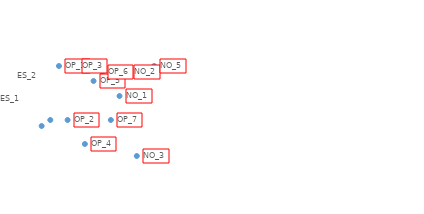
| Category | Series 0 |
|---|---|
| 0 | 5 |
| 1 | 5.333 |
| 2 | 8.333 |
| 3 | 5.333 |
| 4 | 8.333 |
| 5 | 4 |
| 6 | 7.5 |
| 7 | 8 |
| 8 | 5.333 |
| 9 | 6.667 |
| 10 | 8 |
| 11 | 3.333 |
| 12 | 12.5 |
| 13 | 8.333 |